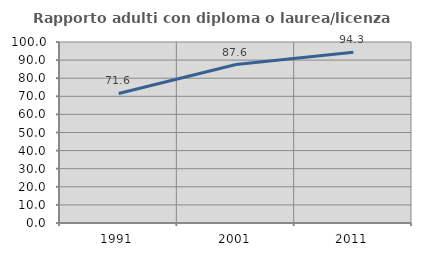
| Category | Rapporto adulti con diploma o laurea/licenza media  |
|---|---|
| 1991.0 | 71.561 |
| 2001.0 | 87.551 |
| 2011.0 | 94.293 |